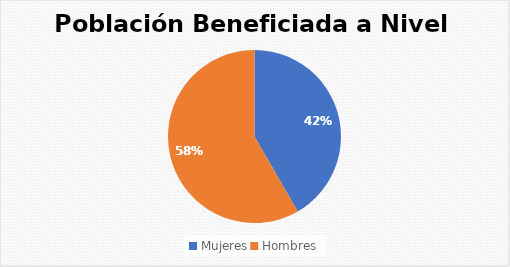
| Category | Series 0 |
|---|---|
| Mujeres | 10 |
| Hombres | 14 |